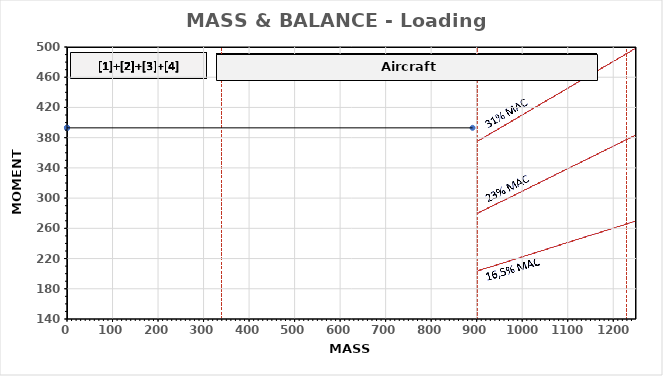
| Category | Series 0 |
|---|---|
| 0.0 | 393 |
| 0.0 | 393 |
| 0.0 | 393 |
| 0.0 | 393 |
| 0.0 | 393 |
| 891.0 | 393 |